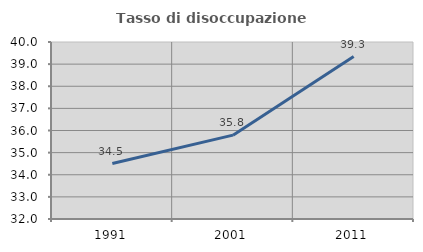
| Category | Tasso di disoccupazione giovanile  |
|---|---|
| 1991.0 | 34.507 |
| 2001.0 | 35.789 |
| 2011.0 | 39.344 |